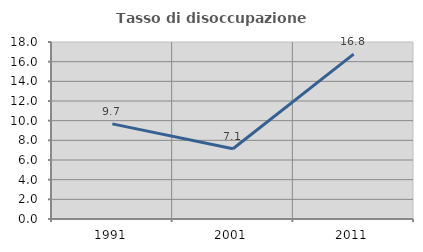
| Category | Tasso di disoccupazione giovanile  |
|---|---|
| 1991.0 | 9.672 |
| 2001.0 | 7.143 |
| 2011.0 | 16.761 |